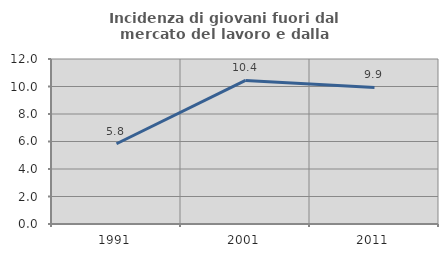
| Category | Incidenza di giovani fuori dal mercato del lavoro e dalla formazione  |
|---|---|
| 1991.0 | 5.837 |
| 2001.0 | 10.44 |
| 2011.0 | 9.934 |